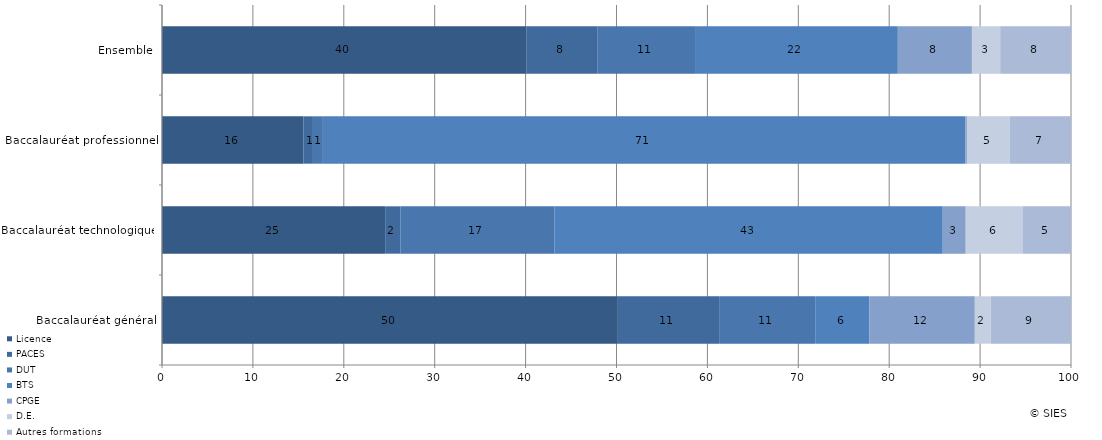
| Category | Licence | PACES | DUT | BTS | CPGE | D.E. | Autres formations |
|---|---|---|---|---|---|---|---|
| Baccalauréat général | 50.15 | 11.14 | 10.57 | 5.97 | 11.59 | 1.75 | 8.83 |
| Baccalauréat technologique | 24.55 | 1.67 | 16.97 | 42.7 | 2.53 | 6.24 | 5.33 |
| Baccalauréat professionnel | 15.57 | 0.93 | 1.2 | 70.67 | 0.18 | 4.7 | 6.75 |
| Ensemble | 40.12 | 7.76 | 10.76 | 22.31 | 8.15 | 3.11 | 7.8 |